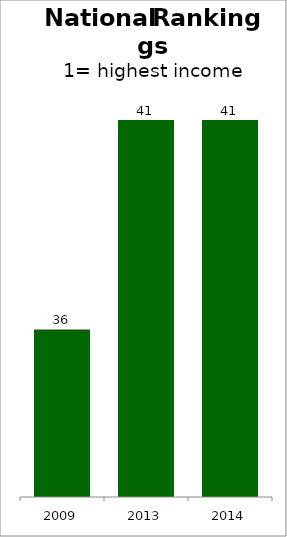
| Category | Series 0 |
|---|---|
| 2009.0 | 36 |
| 2013.0 | 41 |
| 2014.0 | 41 |